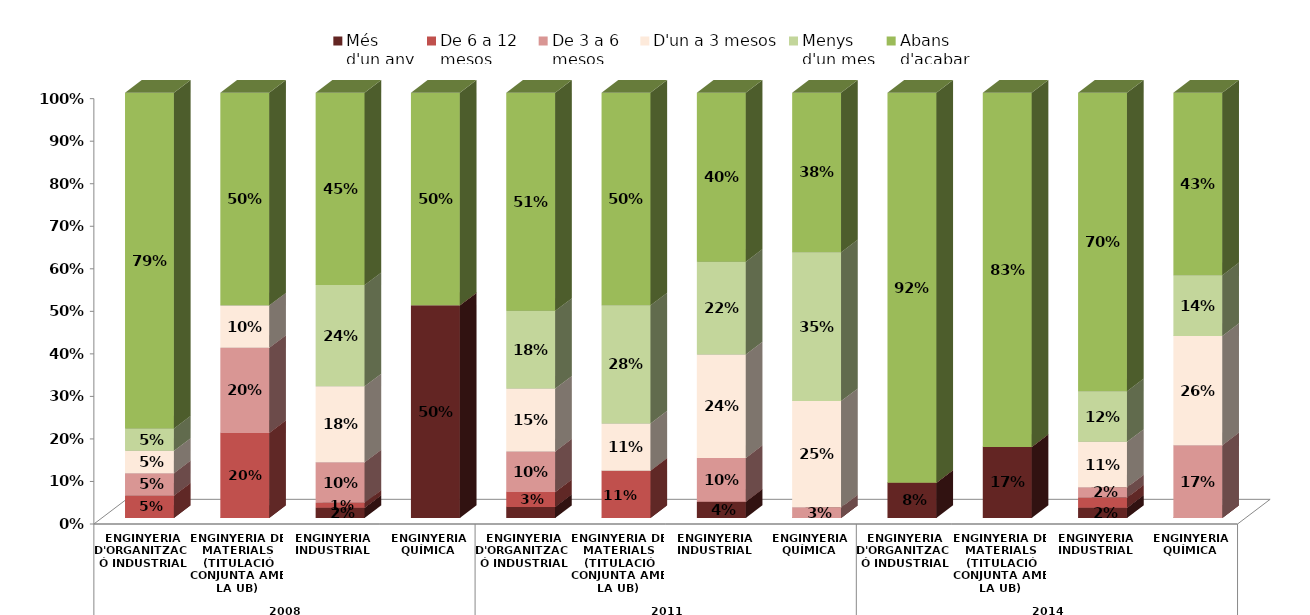
| Category | Més
d'un any | De 6 a 12
mesos | De 3 a 6
mesos | D'un a 3 mesos | Menys
d'un mes | Abans
d'acabar |
|---|---|---|---|---|---|---|
| 0 | 0 | 0.053 | 0.053 | 0.053 | 0.053 | 0.789 |
| 1 | 0 | 0.2 | 0.2 | 0.1 | 0 | 0.5 |
| 2 | 0.024 | 0.012 | 0.095 | 0.179 | 0.238 | 0.452 |
| 3 | 0.5 | 0 | 0 | 0 | 0 | 0.5 |
| 4 | 0.026 | 0.035 | 0.096 | 0.148 | 0.183 | 0.513 |
| 5 | 0 | 0.111 | 0 | 0.111 | 0.278 | 0.5 |
| 6 | 0.038 | 0 | 0.103 | 0.244 | 0.218 | 0.397 |
| 7 | 0 | 0 | 0.025 | 0.25 | 0.35 | 0.375 |
| 8 | 0.083 | 0 | 0 | 0 | 0 | 0.917 |
| 9 | 0.167 | 0 | 0 | 0 | 0 | 0.833 |
| 10 | 0.024 | 0.024 | 0.024 | 0.107 | 0.119 | 0.702 |
| 11 | 0 | 0 | 0.171 | 0.257 | 0.143 | 0.429 |